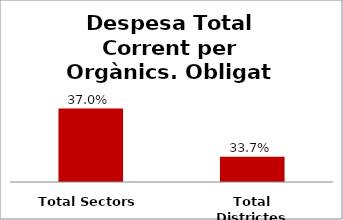
| Category | Series 0 |
|---|---|
| Total Sectors | 0.37 |
| Total Districtes | 0.337 |